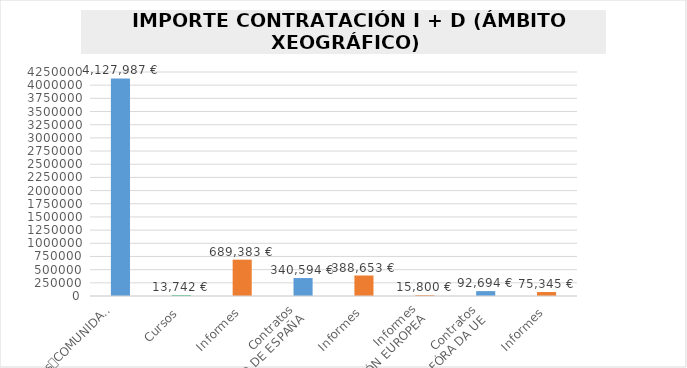
| Category | Series 0 |
|---|---|
| 0 | 4127987.081 |
| 1 | 13742 |
| 2 | 689382.958 |
| 3 | 340594.479 |
| 4 | 388652.722 |
| 5 | 15800 |
| 6 | 92693.9 |
| 7 | 75344.86 |